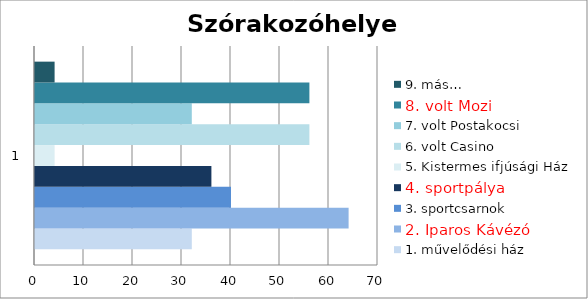
| Category | 1. művelődési ház | 2. Iparos Kávézó | 3. sportcsarnok | 4. sportpálya | 5. Kistermes ifjúsági Ház | 6. volt Casino | 7. volt Postakocsi | 8. volt Mozi | 9. más… |
|---|---|---|---|---|---|---|---|---|---|
| 0 | 32 | 64 | 40 | 36 | 4 | 56 | 32 | 56 | 4 |